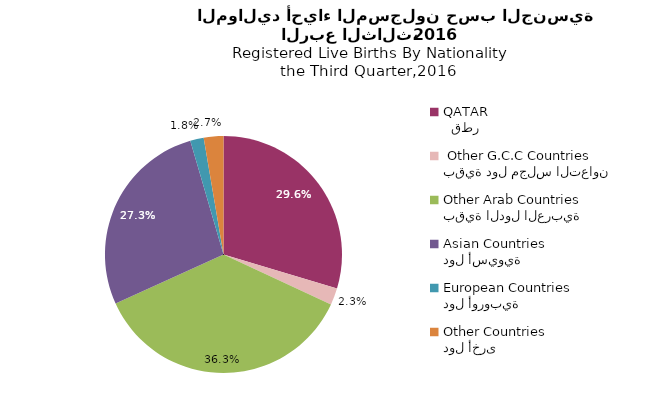
| Category | Series 1 |
|---|---|
|   قطر
QATAR | 1849 |
| بقية دول مجلس التعاون
 Other G.C.C Countries | 142 |
| بقية الدول العربية
Other Arab Countries | 2264 |
| دول أسيوية
Asian Countries | 1700 |
| دول أوروبية
European Countries | 115 |
| دول أخرى
Other Countries | 167 |